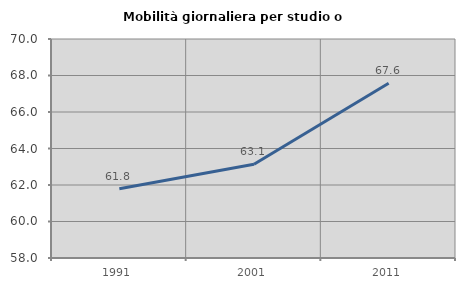
| Category | Mobilità giornaliera per studio o lavoro |
|---|---|
| 1991.0 | 61.794 |
| 2001.0 | 63.135 |
| 2011.0 | 67.571 |